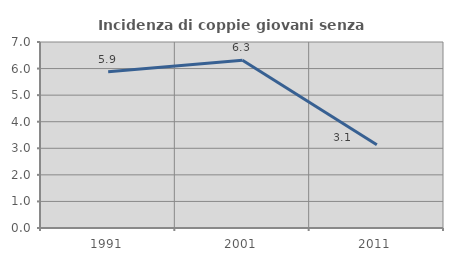
| Category | Incidenza di coppie giovani senza figli |
|---|---|
| 1991.0 | 5.882 |
| 2001.0 | 6.316 |
| 2011.0 | 3.136 |